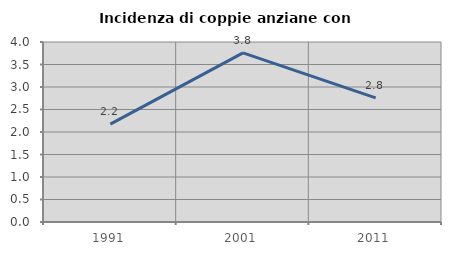
| Category | Incidenza di coppie anziane con figli |
|---|---|
| 1991.0 | 2.174 |
| 2001.0 | 3.759 |
| 2011.0 | 2.759 |